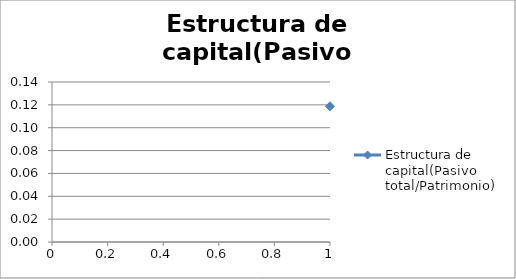
| Category | Estructura de capital(Pasivo total/Patrimonio) |
|---|---|
| 0 | 0.119 |
| 1 | 0.062 |
| 2 | 0.039 |
| 3 | 0.03 |
| 4 | 0.022 |
| 5 | 0.021 |
| 6 | 0.016 |
| 7 | 0.014 |